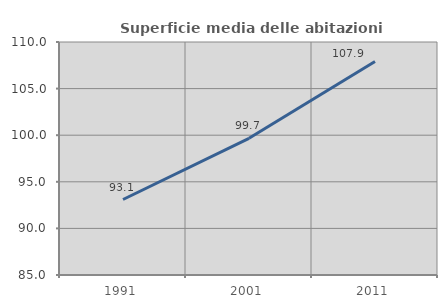
| Category | Superficie media delle abitazioni occupate |
|---|---|
| 1991.0 | 93.101 |
| 2001.0 | 99.666 |
| 2011.0 | 107.917 |